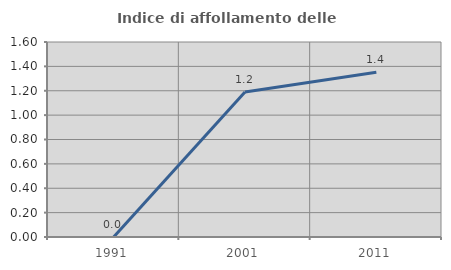
| Category | Indice di affollamento delle abitazioni  |
|---|---|
| 1991.0 | 0 |
| 2001.0 | 1.19 |
| 2011.0 | 1.351 |